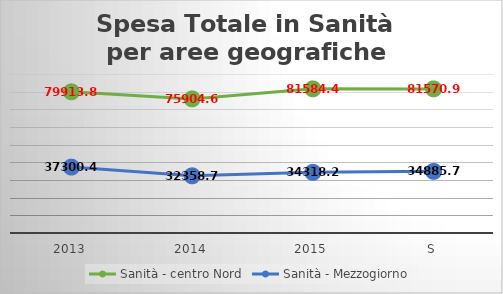
| Category | Sanità - centro Nord | Sanità - Mezzogiorno |
|---|---|---|
| 2013 | 79913.8 | 37300.49 |
| 2014 | 75904.6 | 32358.75 |
| 2015 | 81584.46 | 34318.27 |
| S | 81570.927 | 34885.774 |